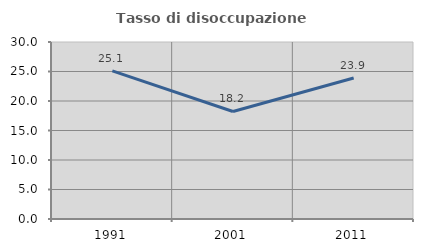
| Category | Tasso di disoccupazione giovanile  |
|---|---|
| 1991.0 | 25.114 |
| 2001.0 | 18.222 |
| 2011.0 | 23.889 |